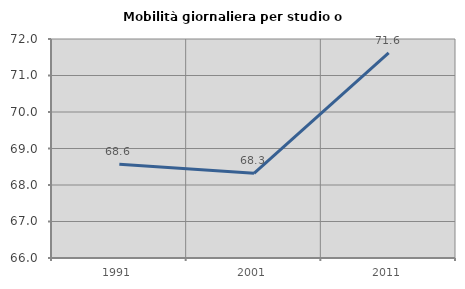
| Category | Mobilità giornaliera per studio o lavoro |
|---|---|
| 1991.0 | 68.569 |
| 2001.0 | 68.321 |
| 2011.0 | 71.62 |